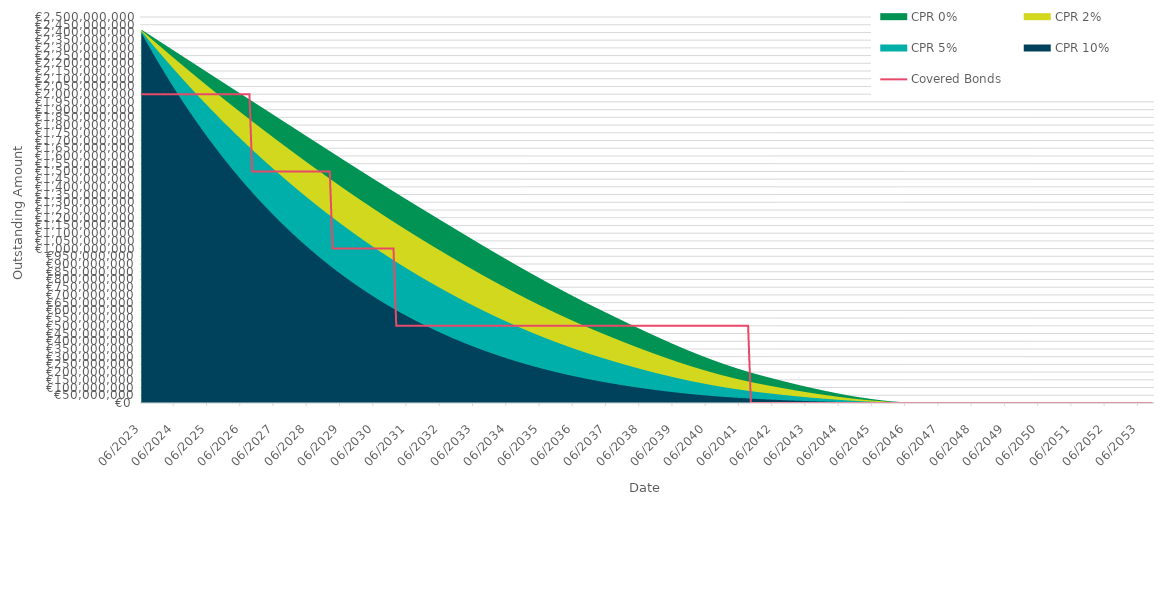
| Category | Covered Bonds |
|---|---|
| 2023-06-30 | 2000000000 |
| 2023-07-31 | 2000000000 |
| 2023-08-31 | 2000000000 |
| 2023-09-30 | 2000000000 |
| 2023-10-31 | 2000000000 |
| 2023-11-30 | 2000000000 |
| 2023-12-31 | 2000000000 |
| 2024-01-31 | 2000000000 |
| 2024-02-29 | 2000000000 |
| 2024-03-31 | 2000000000 |
| 2024-04-30 | 2000000000 |
| 2024-05-31 | 2000000000 |
| 2024-06-30 | 2000000000 |
| 2024-07-31 | 2000000000 |
| 2024-08-31 | 2000000000 |
| 2024-09-30 | 2000000000 |
| 2024-10-31 | 2000000000 |
| 2024-11-30 | 2000000000 |
| 2024-12-31 | 2000000000 |
| 2025-01-31 | 2000000000 |
| 2025-02-28 | 2000000000 |
| 2025-03-31 | 2000000000 |
| 2025-04-30 | 2000000000 |
| 2025-05-31 | 2000000000 |
| 2025-06-30 | 2000000000 |
| 2025-07-31 | 2000000000 |
| 2025-08-31 | 2000000000 |
| 2025-09-30 | 2000000000 |
| 2025-10-31 | 2000000000 |
| 2025-11-30 | 2000000000 |
| 2025-12-31 | 2000000000 |
| 2026-01-31 | 2000000000 |
| 2026-02-28 | 2000000000 |
| 2026-03-31 | 2000000000 |
| 2026-04-30 | 2000000000 |
| 2026-05-31 | 2000000000 |
| 2026-06-30 | 2000000000 |
| 2026-07-31 | 2000000000 |
| 2026-08-31 | 2000000000 |
| 2026-09-30 | 2000000000 |
| 2026-10-31 | 1500000000 |
| 2026-11-30 | 1500000000 |
| 2026-12-31 | 1500000000 |
| 2027-01-31 | 1500000000 |
| 2027-02-28 | 1500000000 |
| 2027-03-31 | 1500000000 |
| 2027-04-30 | 1500000000 |
| 2027-05-31 | 1500000000 |
| 2027-06-30 | 1500000000 |
| 2027-07-31 | 1500000000 |
| 2027-08-31 | 1500000000 |
| 2027-09-30 | 1500000000 |
| 2027-10-31 | 1500000000 |
| 2027-11-30 | 1500000000 |
| 2027-12-31 | 1500000000 |
| 2028-01-31 | 1500000000 |
| 2028-02-29 | 1500000000 |
| 2028-03-31 | 1500000000 |
| 2028-04-30 | 1500000000 |
| 2028-05-31 | 1500000000 |
| 2028-06-30 | 1500000000 |
| 2028-07-31 | 1500000000 |
| 2028-08-31 | 1500000000 |
| 2028-09-30 | 1500000000 |
| 2028-10-31 | 1500000000 |
| 2028-11-30 | 1500000000 |
| 2028-12-31 | 1500000000 |
| 2029-01-31 | 1500000000 |
| 2029-02-28 | 1500000000 |
| 2029-03-31 | 1000000000 |
| 2029-04-30 | 1000000000 |
| 2029-05-31 | 1000000000 |
| 2029-06-30 | 1000000000 |
| 2029-07-31 | 1000000000 |
| 2029-08-31 | 1000000000 |
| 2029-09-30 | 1000000000 |
| 2029-10-31 | 1000000000 |
| 2029-11-30 | 1000000000 |
| 2029-12-31 | 1000000000 |
| 2030-01-31 | 1000000000 |
| 2030-02-28 | 1000000000 |
| 2030-03-31 | 1000000000 |
| 2030-04-30 | 1000000000 |
| 2030-05-31 | 1000000000 |
| 2030-06-30 | 1000000000 |
| 2030-07-31 | 1000000000 |
| 2030-08-31 | 1000000000 |
| 2030-09-30 | 1000000000 |
| 2030-10-31 | 1000000000 |
| 2030-11-30 | 1000000000 |
| 2030-12-31 | 1000000000 |
| 2031-01-31 | 1000000000 |
| 2031-02-28 | 500000000 |
| 2031-03-31 | 500000000 |
| 2031-04-30 | 500000000 |
| 2031-05-31 | 500000000 |
| 2031-06-30 | 500000000 |
| 2031-07-31 | 500000000 |
| 2031-08-31 | 500000000 |
| 2031-09-30 | 500000000 |
| 2031-10-31 | 500000000 |
| 2031-11-30 | 500000000 |
| 2031-12-31 | 500000000 |
| 2032-01-31 | 500000000 |
| 2032-02-29 | 500000000 |
| 2032-03-31 | 500000000 |
| 2032-04-30 | 500000000 |
| 2032-05-31 | 500000000 |
| 2032-06-30 | 500000000 |
| 2032-07-31 | 500000000 |
| 2032-08-31 | 500000000 |
| 2032-09-30 | 500000000 |
| 2032-10-31 | 500000000 |
| 2032-11-30 | 500000000 |
| 2032-12-31 | 500000000 |
| 2033-01-31 | 500000000 |
| 2033-02-28 | 500000000 |
| 2033-03-31 | 500000000 |
| 2033-04-30 | 500000000 |
| 2033-05-31 | 500000000 |
| 2033-06-30 | 500000000 |
| 2033-07-31 | 500000000 |
| 2033-08-31 | 500000000 |
| 2033-09-30 | 500000000 |
| 2033-10-31 | 500000000 |
| 2033-11-30 | 500000000 |
| 2033-12-31 | 500000000 |
| 2034-01-31 | 500000000 |
| 2034-02-28 | 500000000 |
| 2034-03-31 | 500000000 |
| 2034-04-30 | 500000000 |
| 2034-05-31 | 500000000 |
| 2034-06-30 | 500000000 |
| 2034-07-31 | 500000000 |
| 2034-08-31 | 500000000 |
| 2034-09-30 | 500000000 |
| 2034-10-31 | 500000000 |
| 2034-11-30 | 500000000 |
| 2034-12-31 | 500000000 |
| 2035-01-31 | 500000000 |
| 2035-02-28 | 500000000 |
| 2035-03-31 | 500000000 |
| 2035-04-30 | 500000000 |
| 2035-05-31 | 500000000 |
| 2035-06-30 | 500000000 |
| 2035-07-31 | 500000000 |
| 2035-08-31 | 500000000 |
| 2035-09-30 | 500000000 |
| 2035-10-31 | 500000000 |
| 2035-11-30 | 500000000 |
| 2035-12-31 | 500000000 |
| 2036-01-31 | 500000000 |
| 2036-02-29 | 500000000 |
| 2036-03-31 | 500000000 |
| 2036-04-30 | 500000000 |
| 2036-05-31 | 500000000 |
| 2036-06-30 | 500000000 |
| 2036-07-31 | 500000000 |
| 2036-08-31 | 500000000 |
| 2036-09-30 | 500000000 |
| 2036-10-31 | 500000000 |
| 2036-11-30 | 500000000 |
| 2036-12-31 | 500000000 |
| 2037-01-31 | 500000000 |
| 2037-02-28 | 500000000 |
| 2037-03-31 | 500000000 |
| 2037-04-30 | 500000000 |
| 2037-05-31 | 500000000 |
| 2037-06-30 | 500000000 |
| 2037-07-31 | 500000000 |
| 2037-08-31 | 500000000 |
| 2037-09-30 | 500000000 |
| 2037-10-31 | 500000000 |
| 2037-11-30 | 500000000 |
| 2037-12-31 | 500000000 |
| 2038-01-31 | 500000000 |
| 2038-02-28 | 500000000 |
| 2038-03-31 | 500000000 |
| 2038-04-30 | 500000000 |
| 2038-05-31 | 500000000 |
| 2038-06-30 | 500000000 |
| 2038-07-31 | 500000000 |
| 2038-08-31 | 500000000 |
| 2038-09-30 | 500000000 |
| 2038-10-31 | 500000000 |
| 2038-11-30 | 500000000 |
| 2038-12-31 | 500000000 |
| 2039-01-31 | 500000000 |
| 2039-02-28 | 500000000 |
| 2039-03-31 | 500000000 |
| 2039-04-30 | 500000000 |
| 2039-05-31 | 500000000 |
| 2039-06-30 | 500000000 |
| 2039-07-31 | 500000000 |
| 2039-08-31 | 500000000 |
| 2039-09-30 | 500000000 |
| 2039-10-31 | 500000000 |
| 2039-11-30 | 500000000 |
| 2039-12-31 | 500000000 |
| 2040-01-31 | 500000000 |
| 2040-02-29 | 500000000 |
| 2040-03-31 | 500000000 |
| 2040-04-30 | 500000000 |
| 2040-05-31 | 500000000 |
| 2040-06-30 | 500000000 |
| 2040-07-31 | 500000000 |
| 2040-08-31 | 500000000 |
| 2040-09-30 | 500000000 |
| 2040-10-31 | 500000000 |
| 2040-11-30 | 500000000 |
| 2040-12-31 | 500000000 |
| 2041-01-31 | 500000000 |
| 2041-02-28 | 500000000 |
| 2041-03-31 | 500000000 |
| 2041-04-30 | 500000000 |
| 2041-05-31 | 500000000 |
| 2041-06-30 | 500000000 |
| 2041-07-31 | 500000000 |
| 2041-08-31 | 500000000 |
| 2041-09-30 | 500000000 |
| 2041-10-31 | 0 |
| 2041-11-30 | 0 |
| 2041-12-31 | 0 |
| 2042-01-31 | 0 |
| 2042-02-28 | 0 |
| 2042-03-31 | 0 |
| 2042-04-30 | 0 |
| 2042-05-31 | 0 |
| 2042-06-30 | 0 |
| 2042-07-31 | 0 |
| 2042-08-31 | 0 |
| 2042-09-30 | 0 |
| 2042-10-31 | 0 |
| 2042-11-30 | 0 |
| 2042-12-31 | 0 |
| 2043-01-31 | 0 |
| 2043-02-28 | 0 |
| 2043-03-31 | 0 |
| 2043-04-30 | 0 |
| 2043-05-31 | 0 |
| 2043-06-30 | 0 |
| 2043-07-31 | 0 |
| 2043-08-31 | 0 |
| 2043-09-30 | 0 |
| 2043-10-31 | 0 |
| 2043-11-30 | 0 |
| 2043-12-31 | 0 |
| 2044-01-31 | 0 |
| 2044-02-29 | 0 |
| 2044-03-31 | 0 |
| 2044-04-30 | 0 |
| 2044-05-31 | 0 |
| 2044-06-30 | 0 |
| 2044-07-31 | 0 |
| 2044-08-31 | 0 |
| 2044-09-30 | 0 |
| 2044-10-31 | 0 |
| 2044-11-30 | 0 |
| 2044-12-31 | 0 |
| 2045-01-31 | 0 |
| 2045-02-28 | 0 |
| 2045-03-31 | 0 |
| 2045-04-30 | 0 |
| 2045-05-31 | 0 |
| 2045-06-30 | 0 |
| 2045-07-31 | 0 |
| 2045-08-31 | 0 |
| 2045-09-30 | 0 |
| 2045-10-31 | 0 |
| 2045-11-30 | 0 |
| 2045-12-31 | 0 |
| 2046-01-31 | 0 |
| 2046-02-28 | 0 |
| 2046-03-31 | 0 |
| 2046-04-30 | 0 |
| 2046-05-31 | 0 |
| 2046-06-30 | 0 |
| 2046-07-31 | 0 |
| 2046-08-31 | 0 |
| 2046-09-30 | 0 |
| 2046-10-31 | 0 |
| 2046-11-30 | 0 |
| 2046-12-31 | 0 |
| 2047-01-31 | 0 |
| 2047-02-28 | 0 |
| 2047-03-31 | 0 |
| 2047-04-30 | 0 |
| 2047-05-31 | 0 |
| 2047-06-30 | 0 |
| 2047-07-31 | 0 |
| 2047-08-31 | 0 |
| 2047-09-30 | 0 |
| 2047-10-31 | 0 |
| 2047-11-30 | 0 |
| 2047-12-31 | 0 |
| 2048-01-31 | 0 |
| 2048-02-29 | 0 |
| 2048-03-31 | 0 |
| 2048-04-30 | 0 |
| 2048-05-31 | 0 |
| 2048-06-30 | 0 |
| 2048-07-31 | 0 |
| 2048-08-31 | 0 |
| 2048-09-30 | 0 |
| 2048-10-31 | 0 |
| 2048-11-30 | 0 |
| 2048-12-31 | 0 |
| 2049-01-31 | 0 |
| 2049-02-28 | 0 |
| 2049-03-31 | 0 |
| 2049-04-30 | 0 |
| 2049-05-31 | 0 |
| 2049-06-30 | 0 |
| 2049-07-31 | 0 |
| 2049-08-31 | 0 |
| 2049-09-30 | 0 |
| 2049-10-31 | 0 |
| 2049-11-30 | 0 |
| 2049-12-31 | 0 |
| 2050-01-31 | 0 |
| 2050-02-28 | 0 |
| 2050-03-31 | 0 |
| 2050-04-30 | 0 |
| 2050-05-31 | 0 |
| 2050-06-30 | 0 |
| 2050-07-31 | 0 |
| 2050-08-31 | 0 |
| 2050-09-30 | 0 |
| 2050-10-31 | 0 |
| 2050-11-30 | 0 |
| 2050-12-31 | 0 |
| 2051-01-31 | 0 |
| 2051-02-28 | 0 |
| 2051-03-31 | 0 |
| 2051-04-30 | 0 |
| 2051-05-31 | 0 |
| 2051-06-30 | 0 |
| 2051-07-31 | 0 |
| 2051-08-31 | 0 |
| 2051-09-30 | 0 |
| 2051-10-31 | 0 |
| 2051-11-30 | 0 |
| 2051-12-31 | 0 |
| 2052-01-31 | 0 |
| 2052-02-29 | 0 |
| 2052-03-31 | 0 |
| 2052-04-30 | 0 |
| 2052-05-31 | 0 |
| 2052-06-30 | 0 |
| 2052-07-31 | 0 |
| 2052-08-31 | 0 |
| 2052-09-30 | 0 |
| 2052-10-31 | 0 |
| 2052-11-30 | 0 |
| 2052-12-31 | 0 |
| 2053-01-31 | 0 |
| 2053-02-28 | 0 |
| 2053-03-31 | 0 |
| 2053-04-30 | 0 |
| 2053-05-31 | 0 |
| 2053-06-30 | 0 |
| 2053-07-31 | 0 |
| 2053-08-31 | 0 |
| 2053-09-30 | 0 |
| 2053-10-31 | 0 |
| 2053-11-30 | 0 |